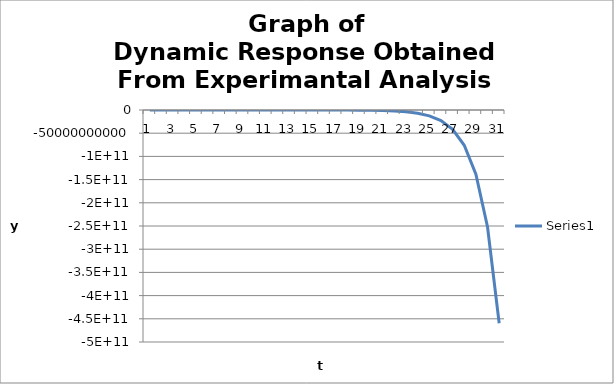
| Category | Series 0 |
|---|---|
| 0 | 0 |
| 1 | -5754.832 |
| 2 | -16240.818 |
| 3 | -35347.532 |
| 4 | -70162.235 |
| 5 | -133598.758 |
| 6 | -249187.641 |
| 7 | -459804.317 |
| 8 | -843572.923 |
| 9 | -1542844.913 |
| 10 | -2817001.554 |
| 11 | -5138666.325 |
| 12 | -9369015.351 |
| 13 | -17077213.843 |
| 14 | -31122467.234 |
| 15 | -56714587.493 |
| 16 | -103346470.959 |
| 17 | -188315302.52 |
| 18 | -343138607.955 |
| 19 | -625245063.526 |
| 20 | -1139276539.933 |
| 21 | -2075902957.087 |
| 22 | -3782547560.727 |
| 23 | -6892256778.603 |
| 24 | -12558516408.244 |
| 25 | -22883114607.305 |
| 26 | -41695759092.292 |
| 27 | -75974632293.451 |
| 28 | -138434811609.485 |
| 29 | -252244678616.992 |
| 30 | -459619776961.314 |